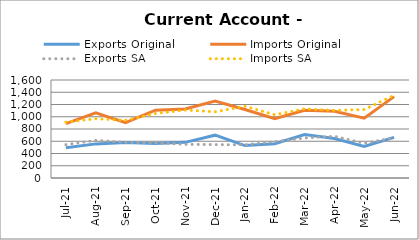
| Category | Exports Original | Imports Original | Exports SA | Imports SA |
|---|---|---|---|---|
| 2021-07-11 | 495 | 889 | 544 | 912 |
| 2021-08-11 | 557 | 1065 | 614 | 968 |
| 2021-09-11 | 581 | 905 | 582 | 942 |
| 2021-10-11 | 564 | 1108 | 575 | 1053 |
| 2021-11-11 | 582 | 1128 | 550 | 1109 |
| 2021-12-11 | 699 | 1257 | 545 | 1081 |
| 2022-01-11 | 529 | 1119 | 542 | 1172 |
| 2022-02-11 | 560 | 968 | 594 | 1033 |
| 2022-03-11 | 711 | 1105 | 654 | 1129 |
| 2022-04-11 | 645 | 1091 | 681 | 1103 |
| 2022-05-11 | 515 | 978 | 566 | 1118 |
| 2022-06-11 | 664 | 1329 | 659 | 1350 |